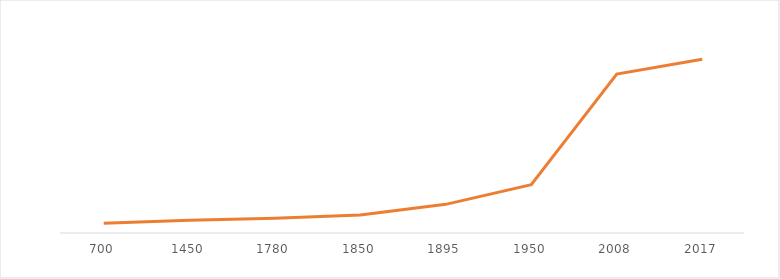
| Category | Series 1 |
|---|---|
| 700.0 | 430 |
| 1450.0 | 560 |
| 1780.0 | 650 |
| 1850.0 | 790.6 |
| 1895.0 | 1252.651 |
| 1950.0 | 2113 |
| 2008.0 | 6946 |
| 2017.0 | 7595.589 |